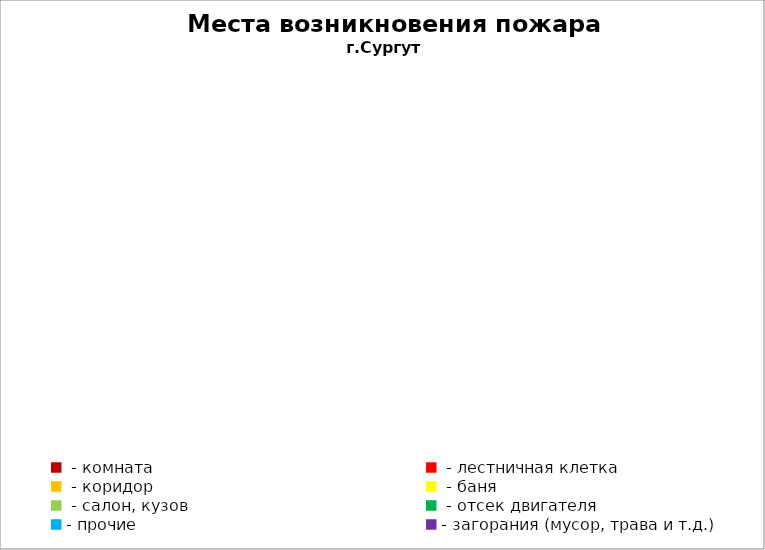
| Category | Места возникновения пожара |
|---|---|
|  - комната | 11 |
|  - лестничная клетка | 2 |
|  - коридор | 0 |
|  - баня | 3 |
|  - салон, кузов | 1 |
|  - отсек двигателя | 2 |
| - прочие | 11 |
| - загорания (мусор, трава и т.д.)  | 10 |